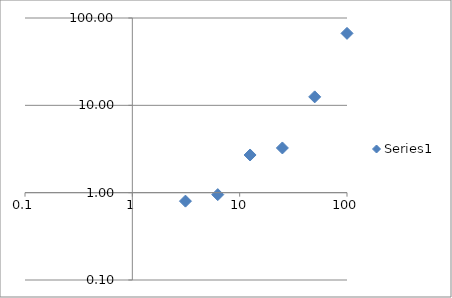
| Category | Series 0 |
|---|---|
| 100.0 | 66.7 |
| 50.0 | 12.5 |
| 25.0 | 3.25 |
| 12.5 | 2.7 |
| 6.25 | 0.95 |
| 3.125 | 0.8 |
| 0.0 | 0.68 |